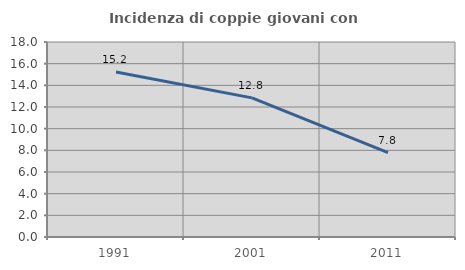
| Category | Incidenza di coppie giovani con figli |
|---|---|
| 1991.0 | 15.238 |
| 2001.0 | 12.841 |
| 2011.0 | 7.787 |